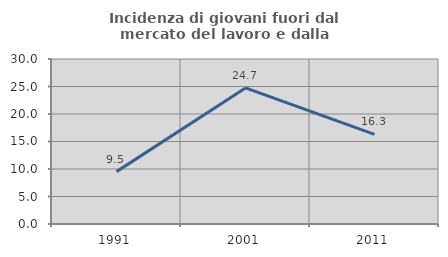
| Category | Incidenza di giovani fuori dal mercato del lavoro e dalla formazione  |
|---|---|
| 1991.0 | 9.524 |
| 2001.0 | 24.747 |
| 2011.0 | 16.296 |